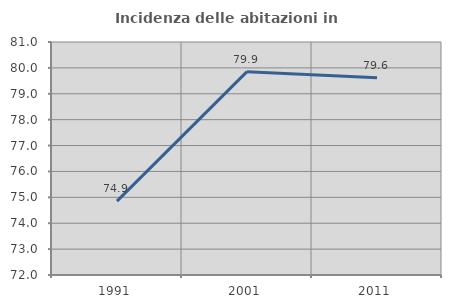
| Category | Incidenza delle abitazioni in proprietà  |
|---|---|
| 1991.0 | 74.854 |
| 2001.0 | 79.855 |
| 2011.0 | 79.623 |